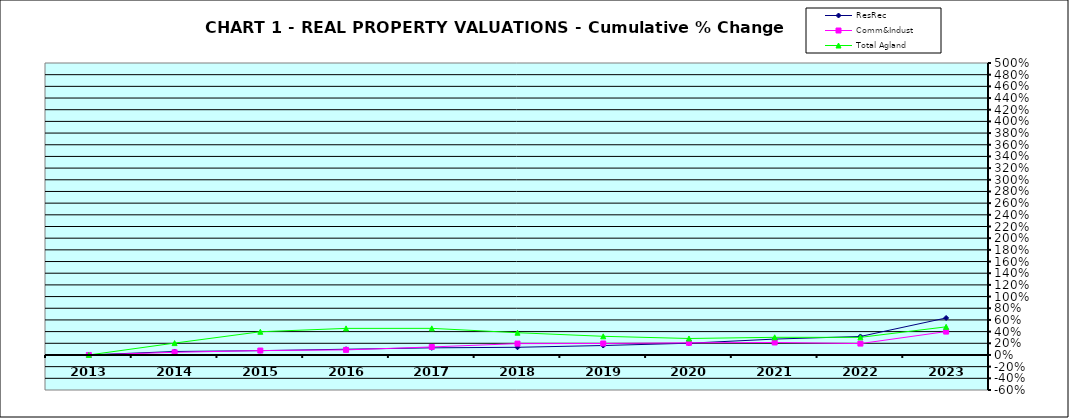
| Category | ResRec | Comm&Indust | Total Agland |
|---|---|---|---|
| 2013.0 | 0 | 0 | 0 |
| 2014.0 | 0.06 | 0.045 | 0.203 |
| 2015.0 | 0.074 | 0.075 | 0.398 |
| 2016.0 | 0.098 | 0.087 | 0.455 |
| 2017.0 | 0.122 | 0.137 | 0.456 |
| 2018.0 | 0.132 | 0.194 | 0.381 |
| 2019.0 | 0.162 | 0.197 | 0.32 |
| 2020.0 | 0.201 | 0.208 | 0.282 |
| 2021.0 | 0.272 | 0.214 | 0.302 |
| 2022.0 | 0.317 | 0.195 | 0.302 |
| 2023.0 | 0.634 | 0.4 | 0.482 |